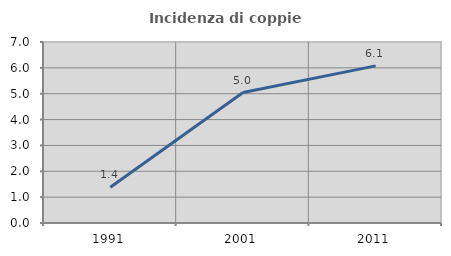
| Category | Incidenza di coppie miste |
|---|---|
| 1991.0 | 1.385 |
| 2001.0 | 5.046 |
| 2011.0 | 6.076 |